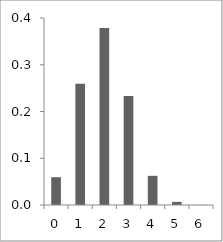
| Category | Series 0 |
|---|---|
| 0.0 | 0.059 |
| 1.0 | 0.26 |
| 2.0 | 0.379 |
| 3.0 | 0.233 |
| 4.0 | 0.062 |
| 5.0 | 0.007 |
| 6.0 | 0 |